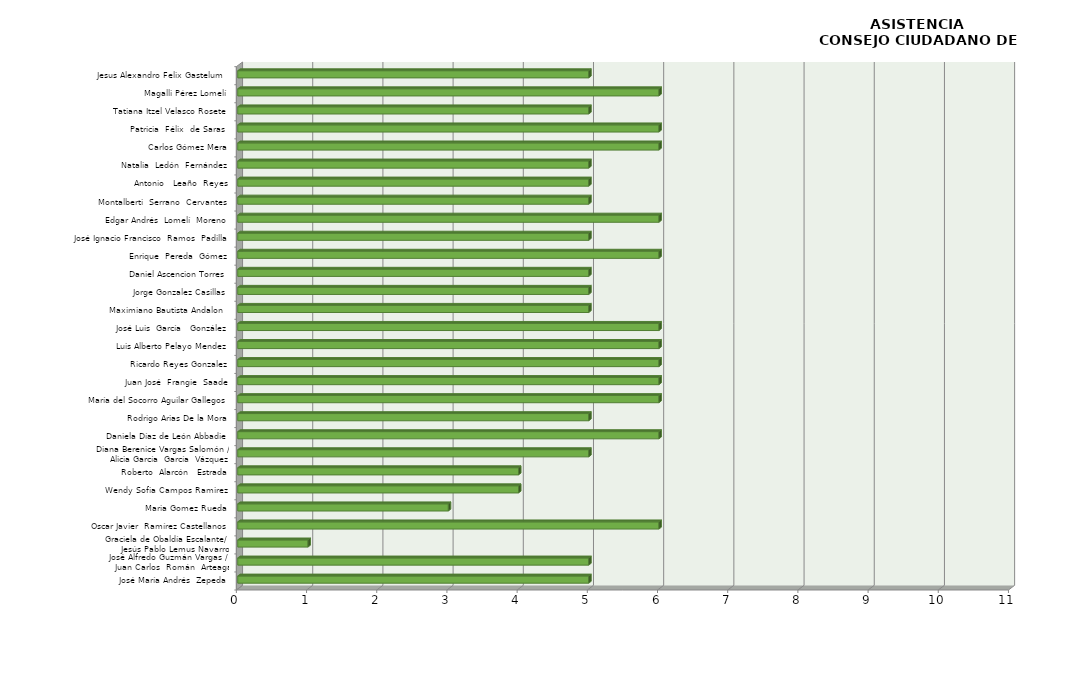
| Category | Series 0 |
|---|---|
| José María Andrés  Zepeda | 5 |
| José Alfredo Guzmán Vargas / 
Juan Carlos  Román  Arteaga | 5 |
| Graciela de Obaldía Escalante/ 
Jesús Pablo Lemus Navarro | 1 |
| Oscar Javier  Ramírez Castellanos | 6 |
| Maria Gomez Rueda | 3 |
| Wendy Sofia Campos Ramirez | 4 |
| Roberto  Alarcón   Estrada | 4 |
| Diana Berenice Vargas Salomón /
Alicia García  García  Vázquez | 5 |
| Daniela Díaz de León Abbadie | 6 |
| Rodrigo Arias De la Mora | 5 |
| María del Socorro Aguilar Gallegos | 6 |
| Juan José  Frangie  Saade | 6 |
| Ricardo Reyes Gonzalez | 6 |
| Luis Alberto Pelayo Mendez | 6 |
| José Luis  García   González | 6 |
| Maximiano Bautista Andalon  | 5 |
| Jorge Gonzalez Casillas | 5 |
| Daniel Ascencion Torres | 5 |
| Enrique  Pereda  Gómez | 6 |
| José Ignacio Francisco  Ramos  Padilla | 5 |
| Edgar Andrés  Lomelí  Moreno | 6 |
| Montalberti  Serrano  Cervantes | 5 |
| Antonio   Leaño  Reyes | 5 |
| Natalia  Ledón  Fernández | 5 |
| Carlos Gómez Mera | 6 |
| Patricia  Félix  de Saras  | 6 |
| Tatiana Itzel Velasco Rosete | 5 |
| Magalli Pérez Lomelí | 6 |
| Jesus Alexandro Felix Gastelum  | 5 |